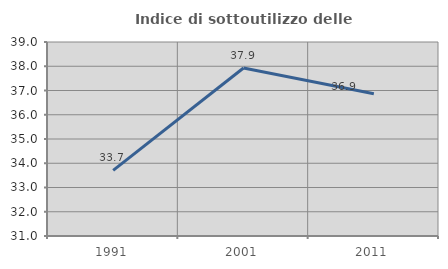
| Category | Indice di sottoutilizzo delle abitazioni  |
|---|---|
| 1991.0 | 33.706 |
| 2001.0 | 37.928 |
| 2011.0 | 36.868 |